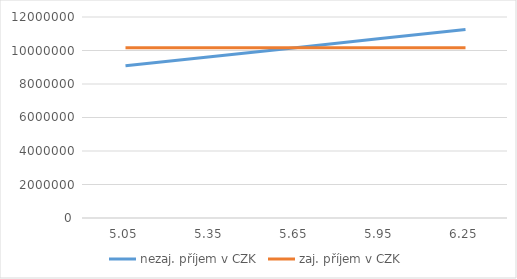
| Category | nezaj. příjem v CZK | zaj. příjem v CZK |
|---|---|---|
| 5.05 | 9090000 | 10170000 |
| 5.35 | 9630000 | 10170000 |
| 5.65 | 10170000 | 10170000 |
| 5.95 | 10710000 | 10170000 |
| 6.25 | 11250000 | 10170000 |